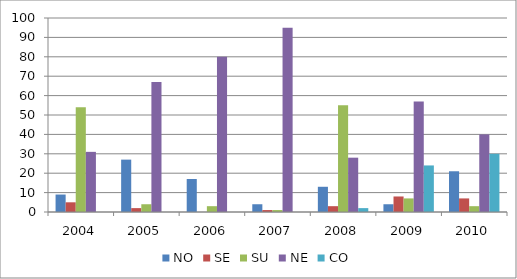
| Category | NO | SE | SU | NE | CO |
|---|---|---|---|---|---|
| 2004.0 | 9 | 5 | 54 | 31 | 0 |
| 2005.0 | 27 | 2 | 4 | 67 | 0 |
| 2006.0 | 17 | 0 | 3 | 80 | 0 |
| 2007.0 | 4 | 1 | 1 | 95 | 0 |
| 2008.0 | 13 | 3 | 55 | 28 | 2 |
| 2009.0 | 4 | 8 | 7 | 57 | 24 |
| 2010.0 | 21 | 7 | 3 | 40 | 30 |